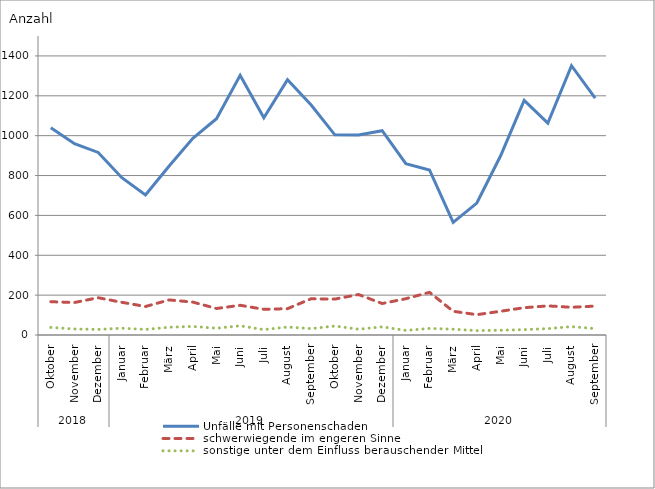
| Category | Unfälle mit Personenschaden | schwerwiegende im engeren Sinne | sonstige unter dem Einfluss berauschender Mittel |
|---|---|---|---|
| 0 | 1040 | 167 | 38 |
| 1 | 960 | 163 | 30 |
| 2 | 916 | 187 | 28 |
| 3 | 789 | 164 | 34 |
| 4 | 702 | 143 | 28 |
| 5 | 848 | 176 | 39 |
| 6 | 987 | 165 | 43 |
| 7 | 1085 | 133 | 34 |
| 8 | 1303 | 149 | 46 |
| 9 | 1090 | 129 | 27 |
| 10 | 1281 | 132 | 40 |
| 11 | 1154 | 182 | 32 |
| 12 | 1004 | 180 | 45 |
| 13 | 1003 | 203 | 29 |
| 14 | 1025 | 158 | 41 |
| 15 | 860 | 182 | 23 |
| 16 | 828 | 214 | 33 |
| 17 | 565 | 119 | 29 |
| 18 | 662 | 102 | 22 |
| 19 | 898 | 119 | 24 |
| 20 | 1177 | 137 | 27 |
| 21 | 1063 | 146 | 32 |
| 22 | 1351 | 139 | 42 |
| 23 | 1188 | 145 | 32 |